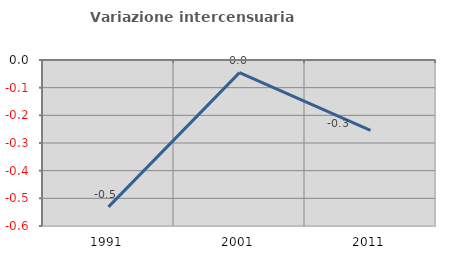
| Category | Variazione intercensuaria annua |
|---|---|
| 1991.0 | -0.531 |
| 2001.0 | -0.046 |
| 2011.0 | -0.255 |